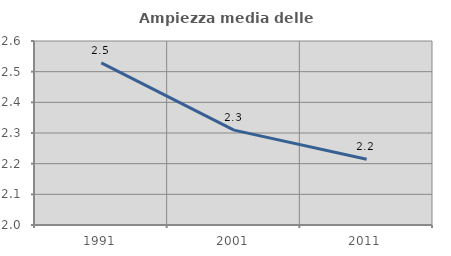
| Category | Ampiezza media delle famiglie |
|---|---|
| 1991.0 | 2.529 |
| 2001.0 | 2.309 |
| 2011.0 | 2.215 |